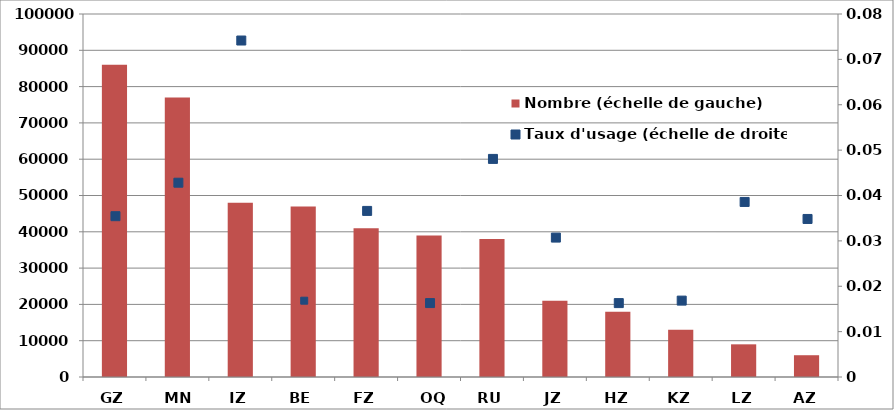
| Category | Nombre (échelle de gauche) |
|---|---|
| GZ | 86000 |
| MN | 77000 |
| IZ | 48000 |
| BE | 47000 |
| FZ | 41000 |
| OQ | 39000 |
| RU | 38000 |
| JZ | 21000 |
| HZ | 18000 |
| KZ | 13000 |
| LZ | 9000 |
| AZ | 6000 |